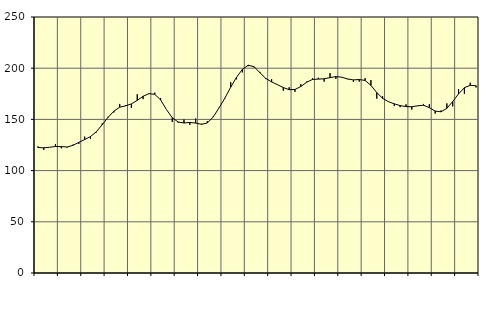
| Category | Piggar | Series 1 |
|---|---|---|
| nan | 123.7 | 122.5 |
| 1.0 | 120.2 | 122.26 |
| 1.0 | 122.8 | 122.79 |
| 1.0 | 125.9 | 123.54 |
| nan | 121.8 | 123.4 |
| 2.0 | 122.5 | 123.05 |
| 2.0 | 125.4 | 124.64 |
| 2.0 | 126.1 | 127.61 |
| nan | 133.2 | 130.32 |
| 3.0 | 130.9 | 133.26 |
| 3.0 | 137.3 | 137.93 |
| 3.0 | 146.1 | 144.79 |
| nan | 152.6 | 151.93 |
| 4.0 | 156.8 | 158.08 |
| 4.0 | 165.1 | 161.92 |
| 4.0 | 163.7 | 163.23 |
| nan | 161.1 | 165.12 |
| 5.0 | 174.5 | 168.56 |
| 5.0 | 169.8 | 172.62 |
| 5.0 | 175.4 | 175.14 |
| nan | 176.1 | 174.48 |
| 6.0 | 170.9 | 169.08 |
| 6.0 | 159.6 | 159.63 |
| 6.0 | 147.5 | 151.57 |
| nan | 146.8 | 147.47 |
| 7.0 | 149.9 | 146.49 |
| 7.0 | 144.7 | 147.03 |
| 7.0 | 150.8 | 146.4 |
| nan | 145.7 | 145.19 |
| 8.0 | 148.3 | 146.56 |
| 8.0 | 152.7 | 152.31 |
| 8.0 | 161.5 | 161.21 |
| nan | 170.4 | 170.77 |
| 9.0 | 186.3 | 181.45 |
| 9.0 | 189.2 | 191.17 |
| 9.0 | 195.9 | 198.88 |
| nan | 202 | 202.94 |
| 10.0 | 200.8 | 201.42 |
| 10.0 | 196.4 | 195.61 |
| 10.0 | 189.4 | 190 |
| nan | 189.3 | 186.62 |
| 11.0 | 184.3 | 183.92 |
| 11.0 | 178 | 181.12 |
| 11.0 | 181.4 | 179.01 |
| nan | 177 | 179.23 |
| 12.0 | 184.3 | 182.12 |
| 12.0 | 186.9 | 186.29 |
| 12.0 | 190.2 | 189.03 |
| nan | 190.7 | 189.37 |
| 13.0 | 186.9 | 189.66 |
| 13.0 | 195.2 | 190.79 |
| 13.0 | 189.6 | 191.82 |
| nan | 191 | 191.21 |
| 14.0 | 189.2 | 189.51 |
| 14.0 | 186.6 | 188.56 |
| 14.0 | 186.9 | 188.93 |
| nan | 190.2 | 188.05 |
| 15.0 | 188.4 | 183.21 |
| 15.0 | 170.3 | 176.2 |
| 15.0 | 172.6 | 170.61 |
| nan | 167.4 | 167.29 |
| 16.0 | 163.1 | 165.2 |
| 16.0 | 162 | 163.47 |
| 16.0 | 164.7 | 162.5 |
| nan | 159.6 | 162.36 |
| 17.0 | 163.1 | 163.28 |
| 17.0 | 165.1 | 163.84 |
| 17.0 | 164.8 | 161.45 |
| nan | 155.7 | 158.12 |
| 18.0 | 158.7 | 157.39 |
| 18.0 | 165.6 | 160.81 |
| 18.0 | 162.7 | 167.44 |
| nan | 179.6 | 174.87 |
| 19.0 | 175 | 180.99 |
| 19.0 | 185.8 | 183.27 |
| 19.0 | 181.2 | 182.87 |